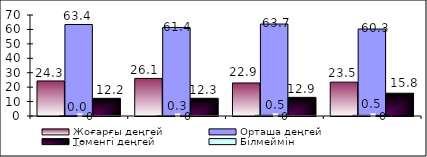
| Category | Жоғарғы деңгей | Орташа деңгей | Төменгі деңгей |
|---|---|---|---|
| 0 | 24.29 | 63.42 | 12.24 |
| 1 | 26.05 | 61.37 | 12.27 |
| 2 | 22.89 | 63.72 | 12.91 |
| 3 | 23.47 | 60.28 | 15.78 |